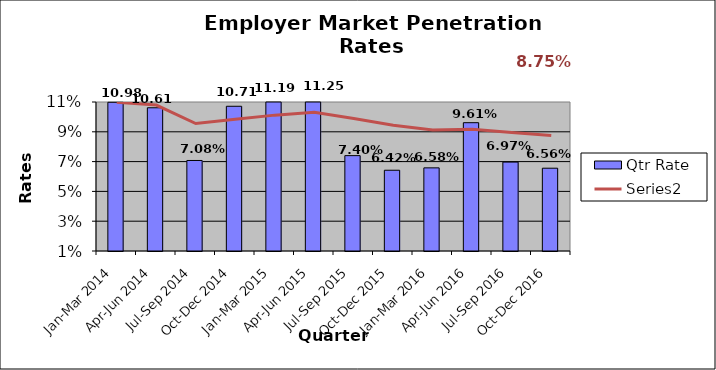
| Category | Qtr Rate |
|---|---|
| Jan-Mar 2014 | 0.11 |
| Apr-Jun 2014 | 0.106 |
| Jul-Sep 2014 | 0.071 |
| Oct-Dec 2014 | 0.107 |
| Jan-Mar 2015 | 0.112 |
| Apr-Jun 2015 | 0.112 |
| Jul-Sep 2015 | 0.074 |
| Oct-Dec 2015 | 0.064 |
| Jan-Mar 2016 | 0.066 |
| Apr-Jun 2016 | 0.096 |
| Jul-Sep 2016 | 0.07 |
| Oct-Dec 2016 | 0.066 |